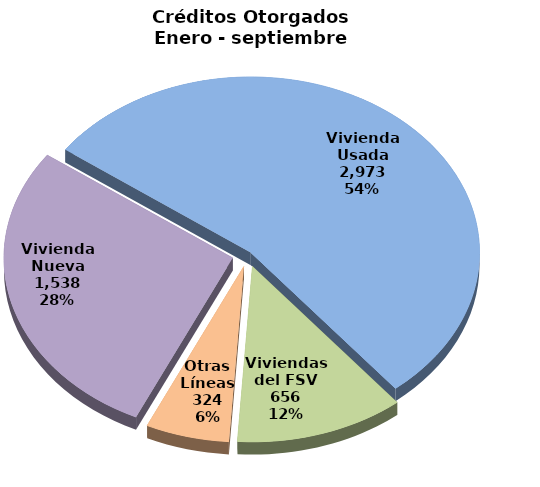
| Category | Series 0 |
|---|---|
| Vivienda Nueva | 1538 |
| Vivienda Usada | 2973 |
| Viviendas del FSV | 656 |
| Otras Líneas | 324 |